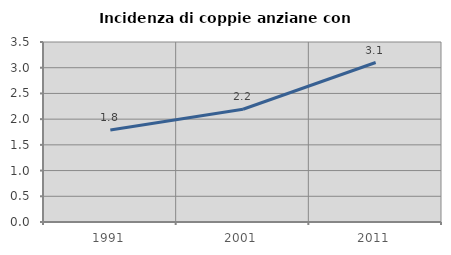
| Category | Incidenza di coppie anziane con figli |
|---|---|
| 1991.0 | 1.787 |
| 2001.0 | 2.192 |
| 2011.0 | 3.101 |